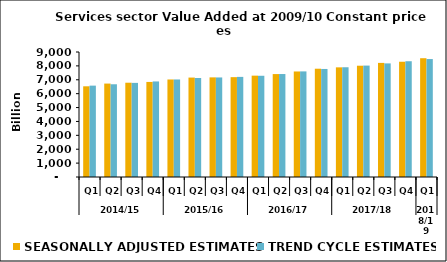
| Category | SEASONALLY ADJUSTED ESTIMATES | TREND CYCLE ESTIMATES |
|---|---|---|
| 0 | 6530.316 | 6578.435 |
| 1 | 6726.709 | 6676.945 |
| 2 | 6788.171 | 6776.683 |
| 3 | 6844.265 | 6880.031 |
| 4 | 7021.144 | 7022.015 |
| 5 | 7158.552 | 7127.501 |
| 6 | 7173.163 | 7167.565 |
| 7 | 7188.775 | 7208.063 |
| 8 | 7297.218 | 7288.502 |
| 9 | 7410.778 | 7413.937 |
| 10 | 7597.697 | 7603.453 |
| 11 | 7796.213 | 7778.72 |
| 12 | 7894.476 | 7902.013 |
| 13 | 8012.397 | 8022.2 |
| 14 | 8215.418 | 8179.431 |
| 15 | 8298.231 | 8335.254 |
| 16 | 8552.606 | 8492.795 |